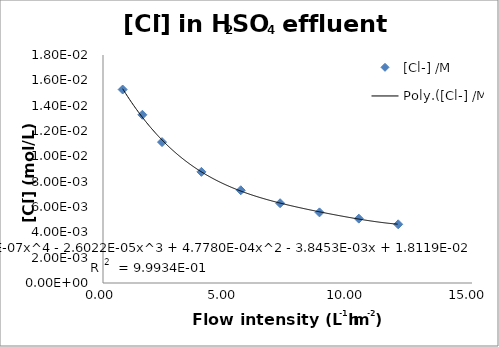
| Category | [Cl-] /M |
|---|---|
| 0.8 | 0.015 |
| 1.6 | 0.013 |
| 2.4 | 0.011 |
| 4.0 | 0.009 |
| 5.6 | 0.007 |
| 7.2 | 0.006 |
| 8.8 | 0.006 |
| 10.4 | 0.005 |
| 12.0 | 0.005 |